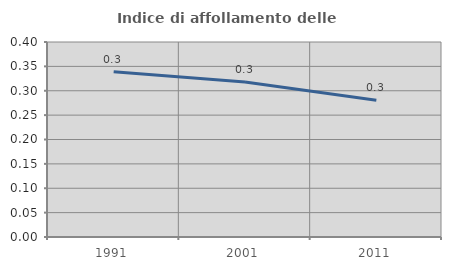
| Category | Indice di affollamento delle abitazioni  |
|---|---|
| 1991.0 | 0.339 |
| 2001.0 | 0.318 |
| 2011.0 | 0.281 |